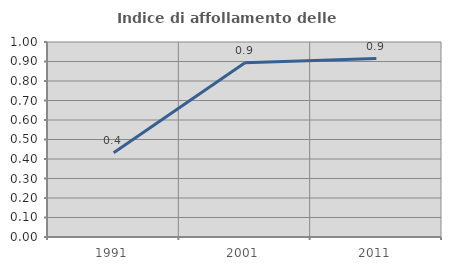
| Category | Indice di affollamento delle abitazioni  |
|---|---|
| 1991.0 | 0.432 |
| 2001.0 | 0.894 |
| 2011.0 | 0.915 |